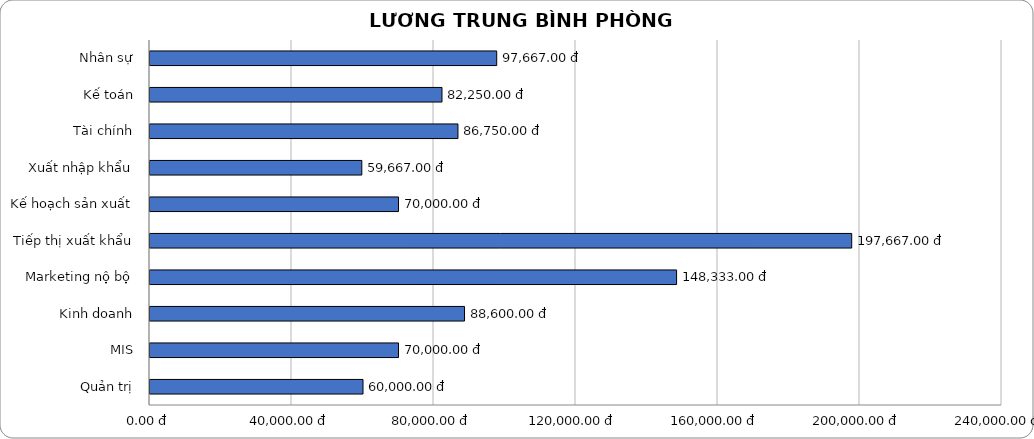
| Category | AVG SALARY |
|---|---|
| Nhân sự | 97667 |
| Kế toán | 82250 |
| Tài chính | 86750 |
| Xuất nhập khẩu | 59667 |
| Kế hoạch sản xuất | 70000 |
| Tiếp thị xuất khẩu | 197667 |
| Marketing nộ bộ | 148333 |
| Kinh doanh | 88600 |
| MIS | 70000 |
| Quản trị | 60000 |